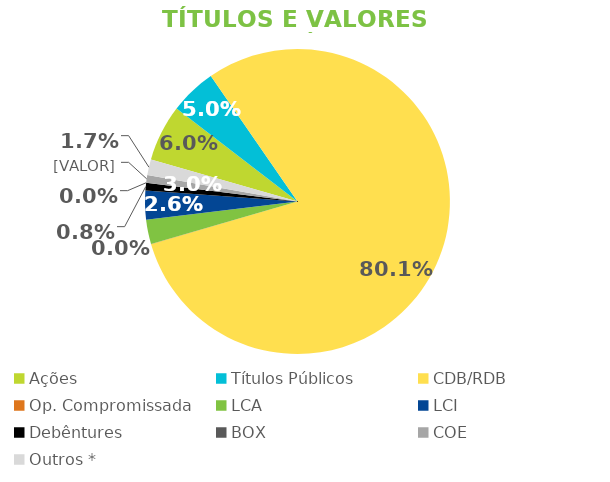
| Category | TVM |
|---|---|
| Ações | 0.06 |
| Títulos Públicos | 0.05 |
| CDB/RDB | 0.801 |
| Op. Compromissada | 0 |
| LCA | 0.026 |
| LCI | 0.03 |
| Debêntures | 0.008 |
| BOX | 0 |
| COE | 0.008 |
| Outros * | 0.017 |